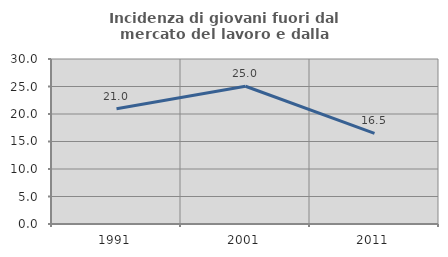
| Category | Incidenza di giovani fuori dal mercato del lavoro e dalla formazione  |
|---|---|
| 1991.0 | 20.953 |
| 2001.0 | 25.048 |
| 2011.0 | 16.483 |